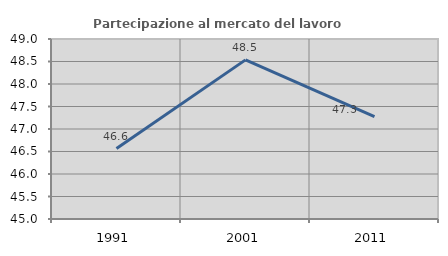
| Category | Partecipazione al mercato del lavoro  femminile |
|---|---|
| 1991.0 | 46.565 |
| 2001.0 | 48.536 |
| 2011.0 | 47.275 |